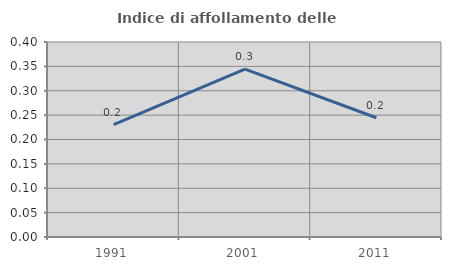
| Category | Indice di affollamento delle abitazioni  |
|---|---|
| 1991.0 | 0.23 |
| 2001.0 | 0.344 |
| 2011.0 | 0.245 |